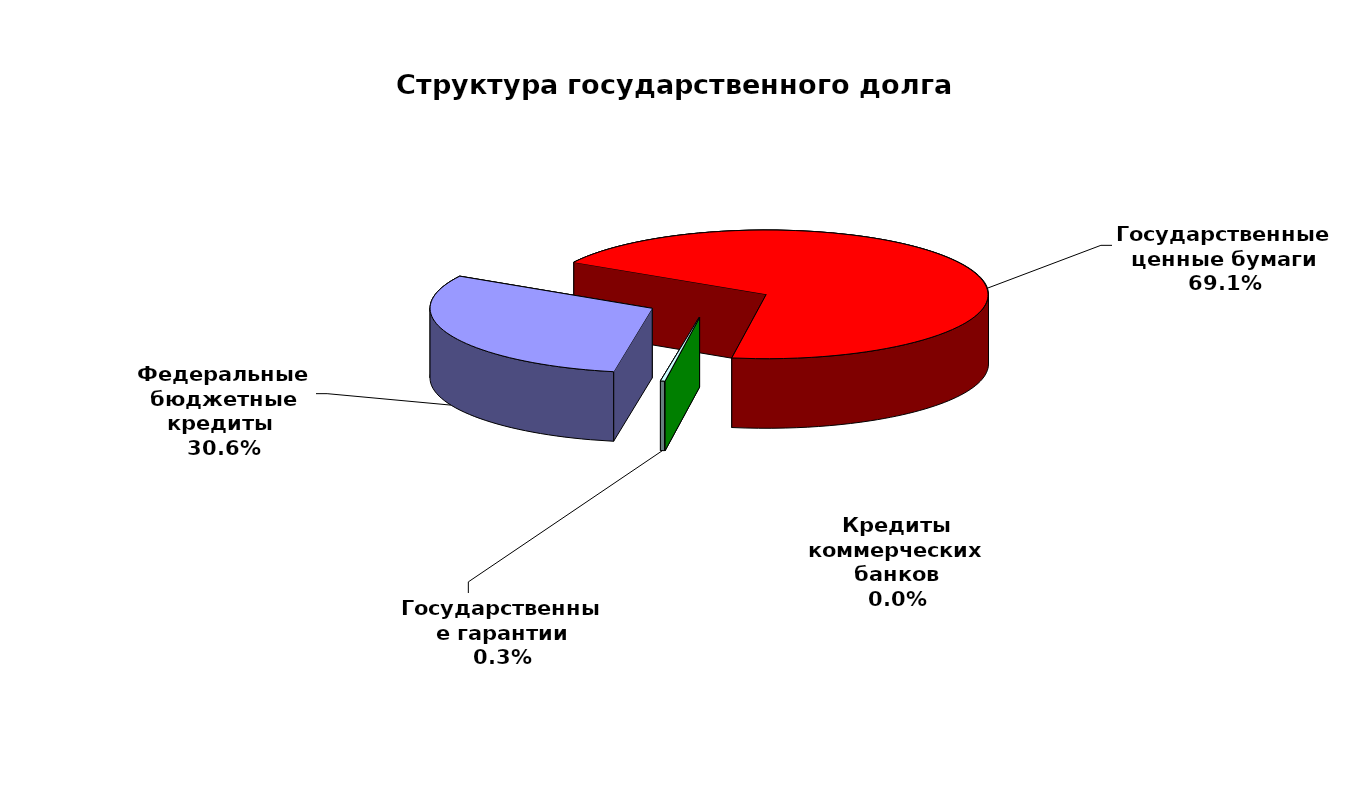
| Category | Series 0 |
|---|---|
| Федеральные бюджетные кредиты  | 18954967.463 |
| Государственные ценные бумаги | 42900000 |
| Кредиты коммерческих банков | 0 |
| Государственные гарантии | 184738.15 |